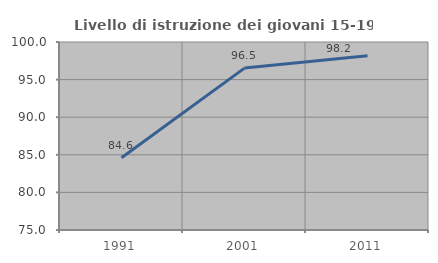
| Category | Livello di istruzione dei giovani 15-19 anni |
|---|---|
| 1991.0 | 84.615 |
| 2001.0 | 96.528 |
| 2011.0 | 98.182 |